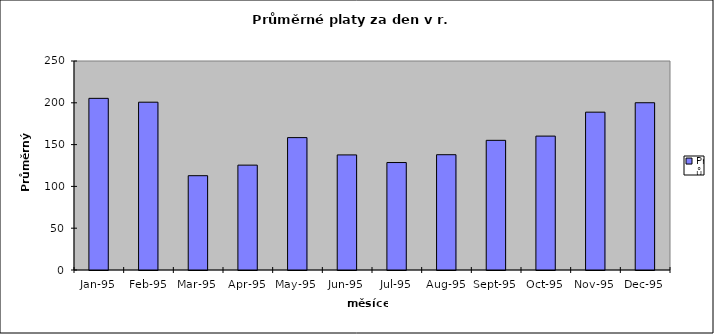
| Category | Průměr na den |
|---|---|
| 1995-01-01 | 205.323 |
| 1995-02-01 | 200.714 |
| 1995-03-01 | 112.806 |
| 1995-04-01 | 125.433 |
| 1995-05-01 | 158.355 |
| 1995-06-01 | 137.667 |
| 1995-07-01 | 128.548 |
| 1995-08-01 | 137.903 |
| 1995-09-01 | 155.1 |
| 1995-10-01 | 160.161 |
| 1995-11-01 | 188.8 |
| 1995-12-01 | 200.065 |